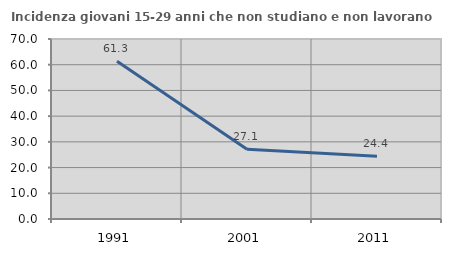
| Category | Incidenza giovani 15-29 anni che non studiano e non lavorano  |
|---|---|
| 1991.0 | 61.326 |
| 2001.0 | 27.149 |
| 2011.0 | 24.424 |